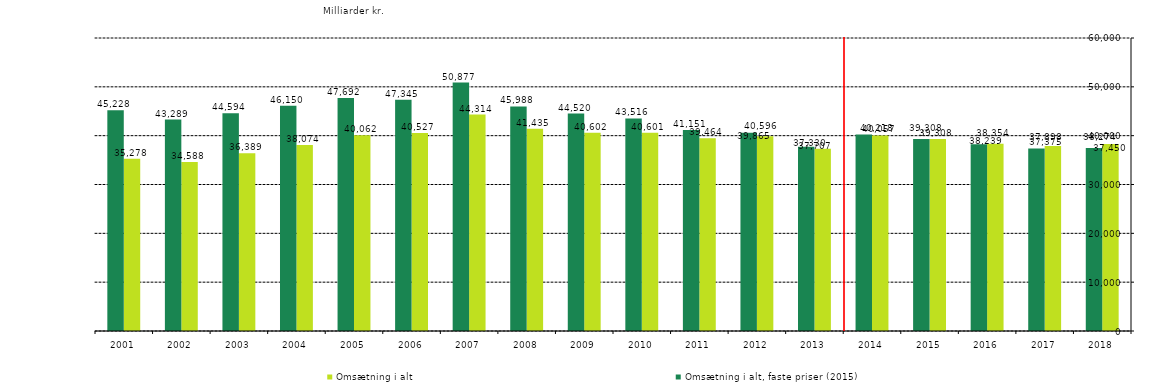
| Category | Omsætning i alt | Omsætning i alt, faste priser (2015) |
|---|---|---|
| 2018.0 | 38273.773 | 37449.876 |
| 2017.0 | 37897.985 | 37374.739 |
| 2016.0 | 38353.811 | 38239.094 |
| 2015.0 | 39307.582 | 39307.582 |
| 2014.0 | 40056.669 | 40217.539 |
| 2013.0 | 37330.068 | 37707.139 |
| 2012.0 | 39864.928 | 40595.65 |
| 2011.0 | 39464.007 | 41151.206 |
| 2010.0 | 40600.517 | 43516.095 |
| 2009.0 | 40601.91 | 44519.638 |
| 2008.0 | 41434.892 | 45987.672 |
| 2007.0 | 44313.991 | 50877.142 |
| 2006.0 | 40527.202 | 47344.862 |
| 2005.0 | 40061.522 | 47692.288 |
| 2004.0 | 38073.875 | 46150.151 |
| 2003.0 | 36389.021 | 44594.388 |
| 2002.0 | 34587.914 | 43289.004 |
| 2001.0 | 35277.741 | 45227.873 |